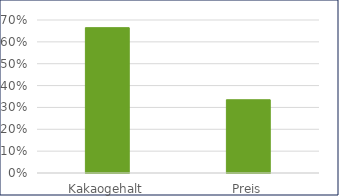
| Category | Series 0 |
|---|---|
| Kakaogehalt | 0.665 |
| Preis | 0.335 |